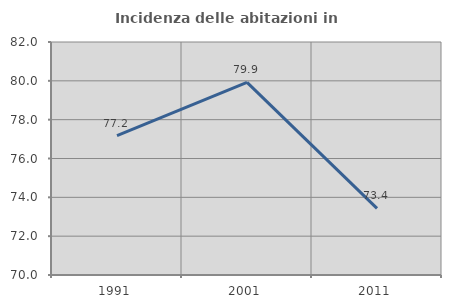
| Category | Incidenza delle abitazioni in proprietà  |
|---|---|
| 1991.0 | 77.174 |
| 2001.0 | 79.922 |
| 2011.0 | 73.432 |